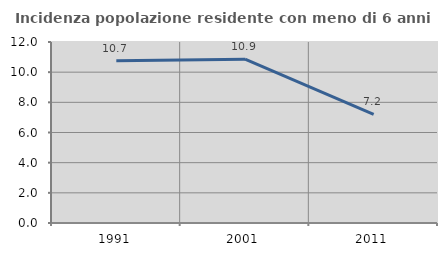
| Category | Incidenza popolazione residente con meno di 6 anni |
|---|---|
| 1991.0 | 10.749 |
| 2001.0 | 10.864 |
| 2011.0 | 7.196 |